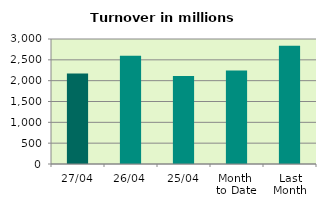
| Category | Series 0 |
|---|---|
| 27/04 | 2171.533 |
| 26/04 | 2596.665 |
| 25/04 | 2113.87 |
| Month 
to Date | 2242.656 |
| Last
Month | 2840.905 |